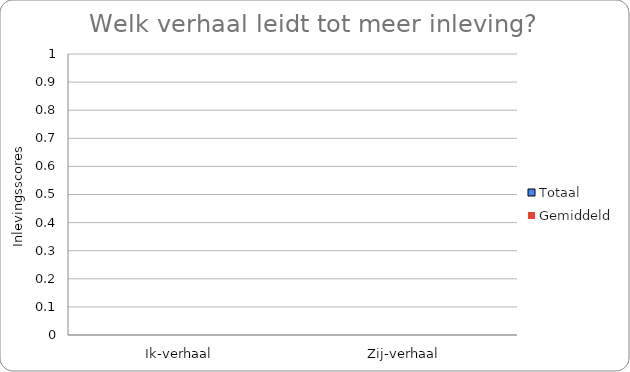
| Category | Totaal | Gemiddeld |
|---|---|---|
| Ik-verhaal | 0 | 0 |
| Zij-verhaal | 0 | 0 |